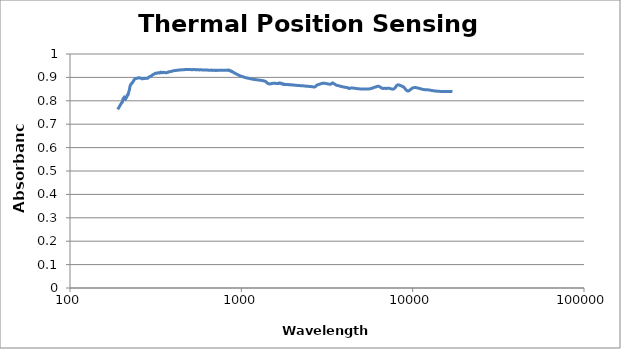
| Category | Absorbance |
|---|---|
| 190.0 | 0.763 |
| 200.0 | 0.791 |
| 202.0 | 0.794 |
| 204.0 | 0.809 |
| 206.0 | 0.812 |
| 208.0 | 0.817 |
| 210.0 | 0.806 |
| 212.0 | 0.812 |
| 214.0 | 0.814 |
| 216.0 | 0.825 |
| 218.0 | 0.825 |
| 220.0 | 0.837 |
| 222.0 | 0.846 |
| 224.0 | 0.862 |
| 226.0 | 0.868 |
| 228.0 | 0.874 |
| 230.0 | 0.875 |
| 232.0 | 0.88 |
| 234.0 | 0.883 |
| 236.0 | 0.888 |
| 238.0 | 0.892 |
| 240.0 | 0.895 |
| 242.0 | 0.896 |
| 244.0 | 0.896 |
| 246.0 | 0.896 |
| 248.0 | 0.897 |
| 250.0 | 0.898 |
| 252.0 | 0.899 |
| 254.0 | 0.898 |
| 256.0 | 0.897 |
| 258.0 | 0.897 |
| 260.0 | 0.897 |
| 262.0 | 0.895 |
| 264.0 | 0.893 |
| 266.0 | 0.894 |
| 268.0 | 0.896 |
| 270.0 | 0.896 |
| 272.0 | 0.896 |
| 274.0 | 0.895 |
| 276.0 | 0.896 |
| 278.0 | 0.896 |
| 280.0 | 0.897 |
| 282.0 | 0.896 |
| 284.0 | 0.896 |
| 286.0 | 0.898 |
| 288.0 | 0.901 |
| 290.0 | 0.902 |
| 292.0 | 0.904 |
| 294.0 | 0.903 |
| 296.0 | 0.905 |
| 298.0 | 0.906 |
| 300.0 | 0.908 |
| 302.0 | 0.91 |
| 304.0 | 0.911 |
| 306.0 | 0.912 |
| 308.0 | 0.913 |
| 310.0 | 0.914 |
| 312.0 | 0.916 |
| 314.0 | 0.918 |
| 316.0 | 0.918 |
| 318.0 | 0.917 |
| 320.0 | 0.917 |
| 322.0 | 0.918 |
| 324.0 | 0.919 |
| 326.0 | 0.92 |
| 328.0 | 0.92 |
| 330.0 | 0.919 |
| 332.0 | 0.919 |
| 334.0 | 0.919 |
| 336.0 | 0.92 |
| 338.0 | 0.922 |
| 340.0 | 0.922 |
| 342.0 | 0.922 |
| 344.0 | 0.92 |
| 346.0 | 0.92 |
| 348.0 | 0.92 |
| 350.0 | 0.921 |
| 352.0 | 0.922 |
| 354.0 | 0.921 |
| 356.0 | 0.921 |
| 358.0 | 0.921 |
| 360.0 | 0.92 |
| 362.0 | 0.92 |
| 364.0 | 0.92 |
| 366.0 | 0.92 |
| 368.0 | 0.92 |
| 370.0 | 0.921 |
| 372.0 | 0.921 |
| 374.0 | 0.923 |
| 376.0 | 0.924 |
| 378.0 | 0.924 |
| 380.0 | 0.924 |
| 382.0 | 0.924 |
| 384.0 | 0.925 |
| 386.0 | 0.925 |
| 388.0 | 0.925 |
| 390.0 | 0.926 |
| 392.0 | 0.926 |
| 394.0 | 0.926 |
| 396.0 | 0.927 |
| 398.0 | 0.927 |
| 400.0 | 0.928 |
| 402.0 | 0.928 |
| 404.0 | 0.928 |
| 406.0 | 0.929 |
| 408.0 | 0.929 |
| 410.0 | 0.929 |
| 412.0 | 0.929 |
| 414.0 | 0.93 |
| 416.0 | 0.93 |
| 418.0 | 0.93 |
| 420.0 | 0.93 |
| 422.0 | 0.93 |
| 424.0 | 0.931 |
| 426.0 | 0.931 |
| 428.0 | 0.931 |
| 430.0 | 0.931 |
| 432.0 | 0.931 |
| 434.0 | 0.931 |
| 436.0 | 0.932 |
| 438.0 | 0.932 |
| 440.0 | 0.932 |
| 442.0 | 0.932 |
| 444.0 | 0.932 |
| 446.0 | 0.932 |
| 448.0 | 0.932 |
| 450.0 | 0.933 |
| 452.0 | 0.933 |
| 454.0 | 0.932 |
| 456.0 | 0.932 |
| 458.0 | 0.933 |
| 460.0 | 0.933 |
| 462.0 | 0.933 |
| 464.0 | 0.933 |
| 466.0 | 0.933 |
| 468.0 | 0.933 |
| 470.0 | 0.934 |
| 472.0 | 0.933 |
| 474.0 | 0.933 |
| 476.0 | 0.933 |
| 478.0 | 0.933 |
| 480.0 | 0.934 |
| 482.0 | 0.934 |
| 484.0 | 0.934 |
| 486.0 | 0.933 |
| 488.0 | 0.934 |
| 490.0 | 0.933 |
| 492.0 | 0.933 |
| 494.0 | 0.934 |
| 496.0 | 0.934 |
| 498.0 | 0.934 |
| 500.0 | 0.934 |
| 502.0 | 0.934 |
| 504.0 | 0.934 |
| 506.0 | 0.933 |
| 508.0 | 0.933 |
| 510.0 | 0.933 |
| 512.0 | 0.933 |
| 514.0 | 0.933 |
| 516.0 | 0.933 |
| 518.0 | 0.933 |
| 520.0 | 0.933 |
| 522.0 | 0.933 |
| 524.0 | 0.933 |
| 526.0 | 0.934 |
| 528.0 | 0.933 |
| 530.0 | 0.933 |
| 532.0 | 0.933 |
| 534.0 | 0.933 |
| 536.0 | 0.933 |
| 538.0 | 0.933 |
| 540.0 | 0.933 |
| 542.0 | 0.933 |
| 544.0 | 0.933 |
| 546.0 | 0.933 |
| 548.0 | 0.933 |
| 550.0 | 0.933 |
| 552.0 | 0.933 |
| 554.0 | 0.933 |
| 556.0 | 0.933 |
| 558.0 | 0.933 |
| 560.0 | 0.933 |
| 562.0 | 0.933 |
| 564.0 | 0.933 |
| 566.0 | 0.933 |
| 568.0 | 0.932 |
| 570.0 | 0.932 |
| 572.0 | 0.932 |
| 574.0 | 0.932 |
| 576.0 | 0.932 |
| 578.0 | 0.933 |
| 580.0 | 0.932 |
| 582.0 | 0.932 |
| 584.0 | 0.932 |
| 586.0 | 0.932 |
| 588.0 | 0.932 |
| 590.0 | 0.932 |
| 592.0 | 0.932 |
| 594.0 | 0.932 |
| 596.0 | 0.932 |
| 598.0 | 0.932 |
| 600.0 | 0.932 |
| 602.0 | 0.932 |
| 604.0 | 0.932 |
| 606.0 | 0.932 |
| 608.0 | 0.932 |
| 610.0 | 0.932 |
| 612.0 | 0.932 |
| 614.0 | 0.932 |
| 616.0 | 0.931 |
| 618.0 | 0.931 |
| 620.0 | 0.931 |
| 622.0 | 0.932 |
| 624.0 | 0.932 |
| 626.0 | 0.932 |
| 628.0 | 0.932 |
| 630.0 | 0.932 |
| 632.0 | 0.932 |
| 634.0 | 0.931 |
| 636.0 | 0.931 |
| 638.0 | 0.931 |
| 640.0 | 0.931 |
| 642.0 | 0.931 |
| 644.0 | 0.931 |
| 646.0 | 0.931 |
| 648.0 | 0.931 |
| 650.0 | 0.931 |
| 652.0 | 0.931 |
| 654.0 | 0.93 |
| 656.0 | 0.93 |
| 658.0 | 0.93 |
| 660.0 | 0.931 |
| 662.0 | 0.931 |
| 664.0 | 0.931 |
| 666.0 | 0.931 |
| 668.0 | 0.931 |
| 670.0 | 0.931 |
| 672.0 | 0.931 |
| 674.0 | 0.931 |
| 676.0 | 0.93 |
| 678.0 | 0.93 |
| 680.0 | 0.93 |
| 682.0 | 0.93 |
| 684.0 | 0.93 |
| 686.0 | 0.931 |
| 688.0 | 0.931 |
| 690.0 | 0.931 |
| 692.0 | 0.93 |
| 694.0 | 0.93 |
| 696.0 | 0.93 |
| 698.0 | 0.93 |
| 700.0 | 0.93 |
| 702.0 | 0.93 |
| 704.0 | 0.93 |
| 706.0 | 0.929 |
| 708.0 | 0.93 |
| 710.0 | 0.93 |
| 712.0 | 0.931 |
| 714.0 | 0.93 |
| 716.0 | 0.93 |
| 718.0 | 0.93 |
| 720.0 | 0.93 |
| 722.0 | 0.93 |
| 724.0 | 0.93 |
| 726.0 | 0.93 |
| 728.0 | 0.93 |
| 730.0 | 0.93 |
| 732.0 | 0.93 |
| 734.0 | 0.93 |
| 736.0 | 0.93 |
| 738.0 | 0.93 |
| 740.0 | 0.93 |
| 742.0 | 0.93 |
| 744.0 | 0.93 |
| 746.0 | 0.93 |
| 748.0 | 0.93 |
| 750.0 | 0.93 |
| 752.0 | 0.93 |
| 754.0 | 0.93 |
| 756.0 | 0.93 |
| 758.0 | 0.93 |
| 760.0 | 0.93 |
| 762.0 | 0.93 |
| 764.0 | 0.93 |
| 766.0 | 0.93 |
| 768.0 | 0.93 |
| 770.0 | 0.93 |
| 772.0 | 0.93 |
| 774.0 | 0.93 |
| 776.0 | 0.93 |
| 778.0 | 0.93 |
| 780.0 | 0.93 |
| 782.0 | 0.93 |
| 784.0 | 0.93 |
| 786.0 | 0.93 |
| 788.0 | 0.93 |
| 790.0 | 0.93 |
| 792.0 | 0.931 |
| 794.0 | 0.931 |
| 796.0 | 0.931 |
| 798.0 | 0.931 |
| 800.0 | 0.931 |
| 802.0 | 0.931 |
| 804.0 | 0.93 |
| 806.0 | 0.931 |
| 808.0 | 0.931 |
| 810.0 | 0.931 |
| 812.0 | 0.931 |
| 814.0 | 0.931 |
| 816.0 | 0.93 |
| 818.0 | 0.93 |
| 820.0 | 0.93 |
| 822.0 | 0.93 |
| 824.0 | 0.93 |
| 826.0 | 0.93 |
| 828.0 | 0.93 |
| 830.0 | 0.931 |
| 832.0 | 0.931 |
| 834.0 | 0.931 |
| 836.0 | 0.931 |
| 838.0 | 0.932 |
| 840.0 | 0.932 |
| 842.0 | 0.931 |
| 844.0 | 0.931 |
| 846.0 | 0.931 |
| 848.0 | 0.929 |
| 850.0 | 0.929 |
| 852.0 | 0.93 |
| 854.0 | 0.929 |
| 856.0 | 0.928 |
| 858.0 | 0.929 |
| 860.0 | 0.928 |
| 862.0 | 0.928 |
| 864.0 | 0.928 |
| 866.0 | 0.928 |
| 868.0 | 0.928 |
| 870.0 | 0.927 |
| 872.0 | 0.926 |
| 874.0 | 0.925 |
| 876.0 | 0.925 |
| 878.0 | 0.924 |
| 880.0 | 0.924 |
| 882.0 | 0.925 |
| 884.0 | 0.925 |
| 886.0 | 0.925 |
| 888.0 | 0.924 |
| 890.0 | 0.924 |
| 892.0 | 0.924 |
| 894.0 | 0.923 |
| 896.0 | 0.922 |
| 898.0 | 0.922 |
| 900.0 | 0.921 |
| 902.0 | 0.921 |
| 904.0 | 0.921 |
| 906.0 | 0.92 |
| 908.0 | 0.92 |
| 910.0 | 0.919 |
| 912.0 | 0.919 |
| 914.0 | 0.918 |
| 916.0 | 0.918 |
| 918.0 | 0.918 |
| 920.0 | 0.917 |
| 922.0 | 0.917 |
| 924.0 | 0.917 |
| 926.0 | 0.916 |
| 928.0 | 0.916 |
| 930.0 | 0.916 |
| 932.0 | 0.915 |
| 934.0 | 0.915 |
| 936.0 | 0.915 |
| 938.0 | 0.914 |
| 940.0 | 0.914 |
| 942.0 | 0.913 |
| 944.0 | 0.913 |
| 946.0 | 0.912 |
| 948.0 | 0.912 |
| 950.0 | 0.912 |
| 952.0 | 0.912 |
| 954.0 | 0.911 |
| 956.0 | 0.911 |
| 958.0 | 0.911 |
| 960.0 | 0.91 |
| 962.0 | 0.91 |
| 964.0 | 0.91 |
| 966.0 | 0.909 |
| 968.0 | 0.909 |
| 970.0 | 0.909 |
| 972.0 | 0.909 |
| 974.0 | 0.908 |
| 976.0 | 0.908 |
| 978.0 | 0.908 |
| 980.0 | 0.907 |
| 982.0 | 0.907 |
| 984.0 | 0.907 |
| 986.0 | 0.906 |
| 988.0 | 0.906 |
| 990.0 | 0.906 |
| 992.0 | 0.906 |
| 994.0 | 0.906 |
| 996.0 | 0.905 |
| 998.0 | 0.905 |
| 1000.0 | 0.905 |
| 1002.0 | 0.905 |
| 1004.0 | 0.904 |
| 1006.0 | 0.904 |
| 1008.0 | 0.904 |
| 1010.0 | 0.904 |
| 1012.0 | 0.903 |
| 1014.0 | 0.903 |
| 1016.0 | 0.903 |
| 1018.0 | 0.903 |
| 1020.0 | 0.903 |
| 1022.0 | 0.903 |
| 1024.0 | 0.902 |
| 1026.0 | 0.902 |
| 1028.0 | 0.902 |
| 1030.0 | 0.902 |
| 1032.0 | 0.901 |
| 1034.0 | 0.901 |
| 1036.0 | 0.901 |
| 1038.0 | 0.901 |
| 1040.0 | 0.901 |
| 1042.0 | 0.9 |
| 1044.0 | 0.9 |
| 1046.0 | 0.9 |
| 1048.0 | 0.9 |
| 1050.0 | 0.9 |
| 1052.0 | 0.9 |
| 1054.0 | 0.899 |
| 1056.0 | 0.899 |
| 1058.0 | 0.899 |
| 1060.0 | 0.899 |
| 1062.0 | 0.899 |
| 1064.0 | 0.898 |
| 1066.0 | 0.898 |
| 1068.0 | 0.898 |
| 1070.0 | 0.898 |
| 1072.0 | 0.898 |
| 1074.0 | 0.898 |
| 1076.0 | 0.898 |
| 1078.0 | 0.898 |
| 1080.0 | 0.897 |
| 1082.0 | 0.897 |
| 1084.0 | 0.897 |
| 1086.0 | 0.897 |
| 1088.0 | 0.897 |
| 1090.0 | 0.897 |
| 1092.0 | 0.897 |
| 1094.0 | 0.896 |
| 1096.0 | 0.896 |
| 1098.0 | 0.896 |
| 1100.0 | 0.896 |
| 1102.0 | 0.896 |
| 1104.0 | 0.896 |
| 1106.0 | 0.896 |
| 1108.0 | 0.896 |
| 1110.0 | 0.896 |
| 1112.0 | 0.896 |
| 1114.0 | 0.895 |
| 1116.0 | 0.895 |
| 1118.0 | 0.895 |
| 1120.0 | 0.895 |
| 1122.0 | 0.895 |
| 1124.0 | 0.895 |
| 1126.0 | 0.895 |
| 1128.0 | 0.894 |
| 1130.0 | 0.894 |
| 1132.0 | 0.894 |
| 1134.0 | 0.894 |
| 1136.0 | 0.894 |
| 1138.0 | 0.894 |
| 1140.0 | 0.894 |
| 1142.0 | 0.894 |
| 1144.0 | 0.894 |
| 1146.0 | 0.893 |
| 1148.0 | 0.893 |
| 1150.0 | 0.893 |
| 1152.0 | 0.893 |
| 1154.0 | 0.893 |
| 1156.0 | 0.893 |
| 1158.0 | 0.893 |
| 1160.0 | 0.893 |
| 1162.0 | 0.893 |
| 1164.0 | 0.892 |
| 1166.0 | 0.892 |
| 1168.0 | 0.892 |
| 1170.0 | 0.892 |
| 1172.0 | 0.892 |
| 1174.0 | 0.892 |
| 1176.0 | 0.892 |
| 1178.0 | 0.892 |
| 1180.0 | 0.892 |
| 1182.0 | 0.892 |
| 1184.0 | 0.892 |
| 1186.0 | 0.891 |
| 1188.0 | 0.891 |
| 1190.0 | 0.891 |
| 1192.0 | 0.891 |
| 1194.0 | 0.891 |
| 1196.0 | 0.891 |
| 1198.0 | 0.891 |
| 1200.0 | 0.891 |
| 1202.0 | 0.891 |
| 1204.0 | 0.891 |
| 1206.0 | 0.891 |
| 1208.0 | 0.891 |
| 1210.0 | 0.89 |
| 1212.0 | 0.89 |
| 1214.0 | 0.89 |
| 1216.0 | 0.89 |
| 1218.0 | 0.89 |
| 1220.0 | 0.89 |
| 1222.0 | 0.89 |
| 1224.0 | 0.89 |
| 1226.0 | 0.89 |
| 1228.0 | 0.89 |
| 1230.0 | 0.89 |
| 1232.0 | 0.89 |
| 1234.0 | 0.89 |
| 1236.0 | 0.89 |
| 1238.0 | 0.89 |
| 1240.0 | 0.889 |
| 1242.0 | 0.889 |
| 1244.0 | 0.889 |
| 1246.0 | 0.889 |
| 1248.0 | 0.889 |
| 1250.0 | 0.889 |
| 1252.0 | 0.889 |
| 1254.0 | 0.889 |
| 1256.0 | 0.889 |
| 1258.0 | 0.889 |
| 1260.0 | 0.889 |
| 1262.0 | 0.889 |
| 1264.0 | 0.889 |
| 1266.0 | 0.889 |
| 1268.0 | 0.889 |
| 1270.0 | 0.888 |
| 1272.0 | 0.888 |
| 1274.0 | 0.888 |
| 1276.0 | 0.888 |
| 1278.0 | 0.888 |
| 1280.0 | 0.888 |
| 1282.0 | 0.888 |
| 1284.0 | 0.888 |
| 1286.0 | 0.888 |
| 1288.0 | 0.888 |
| 1290.0 | 0.888 |
| 1292.0 | 0.888 |
| 1294.0 | 0.888 |
| 1296.0 | 0.888 |
| 1298.0 | 0.887 |
| 1300.0 | 0.887 |
| 1302.0 | 0.887 |
| 1304.0 | 0.887 |
| 1306.0 | 0.887 |
| 1308.0 | 0.887 |
| 1310.0 | 0.887 |
| 1312.0 | 0.887 |
| 1314.0 | 0.887 |
| 1316.0 | 0.887 |
| 1318.0 | 0.887 |
| 1320.0 | 0.887 |
| 1322.0 | 0.887 |
| 1324.0 | 0.886 |
| 1326.0 | 0.886 |
| 1328.0 | 0.886 |
| 1330.0 | 0.886 |
| 1332.0 | 0.886 |
| 1334.0 | 0.886 |
| 1336.0 | 0.886 |
| 1338.0 | 0.886 |
| 1340.0 | 0.886 |
| 1342.0 | 0.886 |
| 1344.0 | 0.885 |
| 1346.0 | 0.885 |
| 1348.0 | 0.885 |
| 1350.0 | 0.885 |
| 1352.0 | 0.885 |
| 1354.0 | 0.885 |
| 1356.0 | 0.885 |
| 1358.0 | 0.885 |
| 1360.0 | 0.885 |
| 1362.0 | 0.885 |
| 1364.0 | 0.885 |
| 1366.0 | 0.884 |
| 1368.0 | 0.884 |
| 1370.0 | 0.884 |
| 1372.0 | 0.884 |
| 1374.0 | 0.884 |
| 1376.0 | 0.884 |
| 1378.0 | 0.883 |
| 1380.0 | 0.883 |
| 1382.0 | 0.883 |
| 1384.0 | 0.883 |
| 1386.0 | 0.882 |
| 1388.0 | 0.882 |
| 1390.0 | 0.882 |
| 1392.0 | 0.881 |
| 1394.0 | 0.881 |
| 1396.0 | 0.881 |
| 1398.0 | 0.88 |
| 1400.0 | 0.88 |
| 1402.0 | 0.879 |
| 1404.0 | 0.879 |
| 1406.0 | 0.878 |
| 1408.0 | 0.878 |
| 1410.0 | 0.878 |
| 1412.0 | 0.877 |
| 1414.0 | 0.877 |
| 1416.0 | 0.876 |
| 1418.0 | 0.876 |
| 1420.0 | 0.876 |
| 1422.0 | 0.875 |
| 1424.0 | 0.875 |
| 1426.0 | 0.875 |
| 1428.0 | 0.874 |
| 1430.0 | 0.874 |
| 1432.0 | 0.874 |
| 1434.0 | 0.874 |
| 1436.0 | 0.873 |
| 1438.0 | 0.873 |
| 1440.0 | 0.873 |
| 1442.0 | 0.873 |
| 1444.0 | 0.873 |
| 1446.0 | 0.873 |
| 1448.0 | 0.873 |
| 1450.0 | 0.873 |
| 1452.0 | 0.873 |
| 1454.0 | 0.872 |
| 1456.0 | 0.872 |
| 1458.0 | 0.872 |
| 1460.0 | 0.872 |
| 1462.0 | 0.872 |
| 1464.0 | 0.872 |
| 1466.0 | 0.872 |
| 1468.0 | 0.872 |
| 1470.0 | 0.872 |
| 1472.0 | 0.872 |
| 1474.0 | 0.872 |
| 1476.0 | 0.872 |
| 1478.0 | 0.872 |
| 1480.0 | 0.872 |
| 1482.0 | 0.873 |
| 1484.0 | 0.873 |
| 1486.0 | 0.873 |
| 1488.0 | 0.873 |
| 1490.0 | 0.873 |
| 1492.0 | 0.873 |
| 1494.0 | 0.873 |
| 1496.0 | 0.873 |
| 1498.0 | 0.873 |
| 1500.0 | 0.873 |
| 1502.0 | 0.873 |
| 1504.0 | 0.874 |
| 1506.0 | 0.874 |
| 1508.0 | 0.874 |
| 1510.0 | 0.874 |
| 1512.0 | 0.874 |
| 1514.0 | 0.874 |
| 1516.0 | 0.874 |
| 1518.0 | 0.874 |
| 1520.0 | 0.874 |
| 1522.0 | 0.874 |
| 1524.0 | 0.874 |
| 1526.0 | 0.874 |
| 1528.0 | 0.875 |
| 1530.0 | 0.875 |
| 1532.0 | 0.875 |
| 1534.0 | 0.875 |
| 1536.0 | 0.875 |
| 1538.0 | 0.875 |
| 1540.0 | 0.875 |
| 1542.0 | 0.875 |
| 1544.0 | 0.875 |
| 1546.0 | 0.875 |
| 1548.0 | 0.875 |
| 1550.0 | 0.875 |
| 1552.0 | 0.875 |
| 1554.0 | 0.875 |
| 1556.0 | 0.875 |
| 1558.0 | 0.875 |
| 1560.0 | 0.875 |
| 1562.0 | 0.875 |
| 1564.0 | 0.875 |
| 1566.0 | 0.875 |
| 1568.0 | 0.875 |
| 1570.0 | 0.874 |
| 1572.0 | 0.875 |
| 1574.0 | 0.875 |
| 1576.0 | 0.874 |
| 1578.0 | 0.874 |
| 1580.0 | 0.874 |
| 1582.0 | 0.874 |
| 1584.0 | 0.874 |
| 1586.0 | 0.875 |
| 1588.0 | 0.874 |
| 1590.0 | 0.875 |
| 1592.0 | 0.874 |
| 1594.0 | 0.874 |
| 1596.0 | 0.874 |
| 1598.0 | 0.874 |
| 1600.0 | 0.874 |
| 1602.0 | 0.874 |
| 1604.0 | 0.874 |
| 1606.0 | 0.874 |
| 1608.0 | 0.874 |
| 1610.0 | 0.874 |
| 1612.0 | 0.874 |
| 1614.0 | 0.874 |
| 1616.0 | 0.874 |
| 1618.0 | 0.874 |
| 1620.0 | 0.874 |
| 1622.0 | 0.874 |
| 1624.0 | 0.874 |
| 1626.0 | 0.874 |
| 1628.0 | 0.874 |
| 1630.0 | 0.874 |
| 1632.0 | 0.874 |
| 1634.0 | 0.874 |
| 1636.0 | 0.874 |
| 1638.0 | 0.874 |
| 1640.0 | 0.874 |
| 1642.0 | 0.874 |
| 1644.0 | 0.874 |
| 1646.0 | 0.874 |
| 1648.0 | 0.874 |
| 1650.0 | 0.875 |
| 1652.0 | 0.875 |
| 1654.0 | 0.875 |
| 1656.0 | 0.876 |
| 1658.0 | 0.876 |
| 1660.0 | 0.875 |
| 1662.0 | 0.875 |
| 1664.0 | 0.875 |
| 1666.0 | 0.875 |
| 1668.0 | 0.875 |
| 1670.0 | 0.875 |
| 1672.0 | 0.876 |
| 1674.0 | 0.875 |
| 1676.0 | 0.876 |
| 1678.0 | 0.876 |
| 1680.0 | 0.876 |
| 1682.0 | 0.876 |
| 1684.0 | 0.876 |
| 1686.0 | 0.876 |
| 1688.0 | 0.875 |
| 1690.0 | 0.875 |
| 1692.0 | 0.875 |
| 1694.0 | 0.875 |
| 1696.0 | 0.875 |
| 1698.0 | 0.875 |
| 1700.0 | 0.875 |
| 1702.0 | 0.875 |
| 1704.0 | 0.874 |
| 1706.0 | 0.874 |
| 1708.0 | 0.873 |
| 1710.0 | 0.873 |
| 1712.0 | 0.872 |
| 1714.0 | 0.872 |
| 1716.0 | 0.873 |
| 1718.0 | 0.873 |
| 1720.0 | 0.872 |
| 1722.0 | 0.873 |
| 1724.0 | 0.873 |
| 1726.0 | 0.873 |
| 1728.0 | 0.873 |
| 1730.0 | 0.874 |
| 1732.0 | 0.874 |
| 1734.0 | 0.873 |
| 1736.0 | 0.873 |
| 1738.0 | 0.873 |
| 1740.0 | 0.873 |
| 1742.0 | 0.872 |
| 1744.0 | 0.872 |
| 1746.0 | 0.872 |
| 1748.0 | 0.871 |
| 1750.0 | 0.871 |
| 1752.0 | 0.871 |
| 1754.0 | 0.87 |
| 1756.0 | 0.871 |
| 1758.0 | 0.872 |
| 1760.0 | 0.871 |
| 1762.0 | 0.871 |
| 1764.0 | 0.871 |
| 1766.0 | 0.871 |
| 1768.0 | 0.87 |
| 1770.0 | 0.87 |
| 1772.0 | 0.871 |
| 1774.0 | 0.871 |
| 1776.0 | 0.87 |
| 1778.0 | 0.871 |
| 1780.0 | 0.871 |
| 1782.0 | 0.871 |
| 1784.0 | 0.87 |
| 1786.0 | 0.87 |
| 1788.0 | 0.87 |
| 1790.0 | 0.87 |
| 1792.0 | 0.87 |
| 1794.0 | 0.87 |
| 1796.0 | 0.871 |
| 1800.0 | 0.87 |
| 1805.0 | 0.87 |
| 1810.0 | 0.87 |
| 1815.0 | 0.87 |
| 1820.0 | 0.87 |
| 1826.0 | 0.87 |
| 1831.0 | 0.87 |
| 1836.0 | 0.869 |
| 1841.0 | 0.869 |
| 1846.0 | 0.869 |
| 1852.0 | 0.869 |
| 1857.0 | 0.869 |
| 1862.0 | 0.869 |
| 1868.0 | 0.869 |
| 1873.0 | 0.87 |
| 1879.0 | 0.87 |
| 1884.0 | 0.869 |
| 1889.0 | 0.869 |
| 1895.0 | 0.869 |
| 1901.0 | 0.869 |
| 1906.0 | 0.869 |
| 1912.0 | 0.869 |
| 1917.0 | 0.869 |
| 1923.0 | 0.869 |
| 1929.0 | 0.868 |
| 1935.0 | 0.868 |
| 1940.0 | 0.868 |
| 1946.0 | 0.868 |
| 1952.0 | 0.868 |
| 1958.0 | 0.868 |
| 1964.0 | 0.868 |
| 1970.0 | 0.868 |
| 1976.0 | 0.868 |
| 1982.0 | 0.868 |
| 1988.0 | 0.868 |
| 1994.0 | 0.868 |
| 2000.0 | 0.867 |
| 2006.0 | 0.867 |
| 2013.0 | 0.867 |
| 2019.0 | 0.868 |
| 2025.0 | 0.868 |
| 2032.0 | 0.867 |
| 2038.0 | 0.867 |
| 2044.0 | 0.867 |
| 2051.0 | 0.867 |
| 2057.0 | 0.867 |
| 2064.0 | 0.867 |
| 2071.0 | 0.866 |
| 2077.0 | 0.866 |
| 2084.0 | 0.866 |
| 2091.0 | 0.866 |
| 2097.0 | 0.866 |
| 2104.0 | 0.866 |
| 2111.0 | 0.866 |
| 2118.0 | 0.866 |
| 2125.0 | 0.866 |
| 2132.0 | 0.866 |
| 2139.0 | 0.865 |
| 2146.0 | 0.865 |
| 2153.0 | 0.865 |
| 2160.0 | 0.866 |
| 2168.0 | 0.866 |
| 2175.0 | 0.865 |
| 2182.0 | 0.865 |
| 2189.0 | 0.865 |
| 2197.0 | 0.865 |
| 2204.0 | 0.865 |
| 2212.0 | 0.865 |
| 2219.0 | 0.864 |
| 2227.0 | 0.864 |
| 2235.0 | 0.864 |
| 2243.0 | 0.864 |
| 2250.0 | 0.864 |
| 2258.0 | 0.864 |
| 2266.0 | 0.864 |
| 2274.0 | 0.864 |
| 2282.0 | 0.864 |
| 2290.0 | 0.864 |
| 2298.0 | 0.864 |
| 2306.0 | 0.864 |
| 2315.0 | 0.864 |
| 2323.0 | 0.863 |
| 2331.0 | 0.863 |
| 2340.0 | 0.863 |
| 2348.0 | 0.863 |
| 2357.0 | 0.863 |
| 2365.0 | 0.863 |
| 2374.0 | 0.863 |
| 2383.0 | 0.863 |
| 2391.0 | 0.863 |
| 2400.0 | 0.862 |
| 2409.0 | 0.862 |
| 2418.0 | 0.862 |
| 2427.0 | 0.862 |
| 2436.0 | 0.862 |
| 2446.0 | 0.862 |
| 2455.0 | 0.862 |
| 2464.0 | 0.862 |
| 2474.0 | 0.862 |
| 2483.0 | 0.862 |
| 2493.0 | 0.862 |
| 2502.0 | 0.861 |
| 2512.0 | 0.861 |
| 2522.0 | 0.861 |
| 2532.0 | 0.861 |
| 2542.0 | 0.861 |
| 2552.0 | 0.861 |
| 2562.0 | 0.861 |
| 2572.0 | 0.86 |
| 2582.0 | 0.86 |
| 2592.0 | 0.86 |
| 2603.0 | 0.86 |
| 2613.0 | 0.86 |
| 2624.0 | 0.86 |
| 2635.0 | 0.859 |
| 2645.0 | 0.859 |
| 2656.0 | 0.859 |
| 2667.0 | 0.859 |
| 2678.0 | 0.859 |
| 2689.0 | 0.86 |
| 2700.0 | 0.86 |
| 2712.0 | 0.861 |
| 2723.0 | 0.862 |
| 2735.0 | 0.864 |
| 2746.0 | 0.866 |
| 2758.0 | 0.867 |
| 2770.0 | 0.868 |
| 2781.0 | 0.868 |
| 2793.0 | 0.868 |
| 2806.0 | 0.869 |
| 2818.0 | 0.869 |
| 2830.0 | 0.87 |
| 2842.0 | 0.87 |
| 2855.0 | 0.87 |
| 2868.0 | 0.871 |
| 2880.0 | 0.872 |
| 2893.0 | 0.872 |
| 2906.0 | 0.873 |
| 2919.0 | 0.873 |
| 2933.0 | 0.873 |
| 2946.0 | 0.874 |
| 2959.0 | 0.874 |
| 2973.0 | 0.875 |
| 2987.0 | 0.875 |
| 3000.0 | 0.875 |
| 3014.0 | 0.875 |
| 3028.0 | 0.875 |
| 3043.0 | 0.875 |
| 3057.0 | 0.875 |
| 3072.0 | 0.875 |
| 3086.0 | 0.875 |
| 3101.0 | 0.874 |
| 3116.0 | 0.874 |
| 3131.0 | 0.874 |
| 3146.0 | 0.873 |
| 3161.0 | 0.873 |
| 3177.0 | 0.873 |
| 3193.0 | 0.872 |
| 3208.0 | 0.872 |
| 3224.0 | 0.872 |
| 3240.0 | 0.871 |
| 3257.0 | 0.871 |
| 3273.0 | 0.871 |
| 3290.0 | 0.871 |
| 3307.0 | 0.871 |
| 3324.0 | 0.871 |
| 3341.0 | 0.872 |
| 3358.0 | 0.873 |
| 3375.0 | 0.874 |
| 3393.0 | 0.876 |
| 3411.0 | 0.877 |
| 3429.0 | 0.876 |
| 3447.0 | 0.875 |
| 3466.0 | 0.873 |
| 3484.0 | 0.873 |
| 3503.0 | 0.872 |
| 3522.0 | 0.87 |
| 3541.0 | 0.869 |
| 3561.0 | 0.868 |
| 3581.0 | 0.867 |
| 3600.0 | 0.866 |
| 3621.0 | 0.866 |
| 3641.0 | 0.865 |
| 3662.0 | 0.865 |
| 3682.0 | 0.865 |
| 3703.0 | 0.864 |
| 3725.0 | 0.864 |
| 3746.0 | 0.863 |
| 3768.0 | 0.863 |
| 3790.0 | 0.862 |
| 3812.0 | 0.862 |
| 3835.0 | 0.861 |
| 3858.0 | 0.861 |
| 3881.0 | 0.86 |
| 3904.0 | 0.86 |
| 3928.0 | 0.859 |
| 3952.0 | 0.859 |
| 3976.0 | 0.859 |
| 4001.0 | 0.858 |
| 4025.0 | 0.858 |
| 4051.0 | 0.858 |
| 4076.0 | 0.857 |
| 4102.0 | 0.857 |
| 4128.0 | 0.857 |
| 4154.0 | 0.857 |
| 4181.0 | 0.856 |
| 4208.0 | 0.854 |
| 4236.0 | 0.853 |
| 4264.0 | 0.852 |
| 4292.0 | 0.853 |
| 4321.0 | 0.854 |
| 4350.0 | 0.855 |
| 4379.0 | 0.855 |
| 4409.0 | 0.855 |
| 4439.0 | 0.855 |
| 4470.0 | 0.855 |
| 4501.0 | 0.854 |
| 4532.0 | 0.854 |
| 4564.0 | 0.854 |
| 4596.0 | 0.853 |
| 4629.0 | 0.853 |
| 4663.0 | 0.853 |
| 4696.0 | 0.852 |
| 4731.0 | 0.852 |
| 4765.0 | 0.852 |
| 4801.0 | 0.852 |
| 4836.0 | 0.851 |
| 4873.0 | 0.851 |
| 4910.0 | 0.851 |
| 4947.0 | 0.851 |
| 4985.0 | 0.851 |
| 5024.0 | 0.851 |
| 5063.0 | 0.851 |
| 5103.0 | 0.851 |
| 5144.0 | 0.85 |
| 5185.0 | 0.85 |
| 5227.0 | 0.85 |
| 5269.0 | 0.85 |
| 5312.0 | 0.851 |
| 5356.0 | 0.851 |
| 5401.0 | 0.851 |
| 5446.0 | 0.851 |
| 5492.0 | 0.851 |
| 5539.0 | 0.851 |
| 5587.0 | 0.851 |
| 5636.0 | 0.851 |
| 5685.0 | 0.852 |
| 5735.0 | 0.853 |
| 5787.0 | 0.854 |
| 5839.0 | 0.855 |
| 5892.0 | 0.856 |
| 5946.0 | 0.857 |
| 6001.0 | 0.858 |
| 6057.0 | 0.859 |
| 6114.0 | 0.86 |
| 6172.0 | 0.861 |
| 6232.0 | 0.862 |
| 6292.0 | 0.862 |
| 6354.0 | 0.862 |
| 6417.0 | 0.86 |
| 6481.0 | 0.858 |
| 6546.0 | 0.856 |
| 6613.0 | 0.854 |
| 6681.0 | 0.853 |
| 6751.0 | 0.853 |
| 6822.0 | 0.853 |
| 6895.0 | 0.853 |
| 6969.0 | 0.853 |
| 7044.0 | 0.853 |
| 7122.0 | 0.854 |
| 7201.0 | 0.854 |
| 7282.0 | 0.854 |
| 7365.0 | 0.853 |
| 7449.0 | 0.851 |
| 7536.0 | 0.85 |
| 7625.0 | 0.85 |
| 7715.0 | 0.85 |
| 7808.0 | 0.852 |
| 7904.0 | 0.856 |
| 8001.0 | 0.861 |
| 8101.0 | 0.866 |
| 8204.0 | 0.868 |
| 8309.0 | 0.868 |
| 8417.0 | 0.866 |
| 8527.0 | 0.864 |
| 8641.0 | 0.863 |
| 8758.0 | 0.861 |
| 8878.0 | 0.858 |
| 9001.0 | 0.853 |
| 9128.0 | 0.848 |
| 9258.0 | 0.843 |
| 9393.0 | 0.842 |
| 9531.0 | 0.844 |
| 9673.0 | 0.847 |
| 9820.0 | 0.851 |
| 9971.0 | 0.854 |
| 10126.0 | 0.856 |
| 10287.0 | 0.857 |
| 10453.0 | 0.856 |
| 10624.0 | 0.855 |
| 10801.0 | 0.854 |
| 10985.0 | 0.852 |
| 11174.0 | 0.851 |
| 11370.0 | 0.85 |
| 11573.0 | 0.848 |
| 11783.0 | 0.847 |
| 12002.0 | 0.847 |
| 12228.0 | 0.847 |
| 12463.0 | 0.846 |
| 12708.0 | 0.845 |
| 12962.0 | 0.844 |
| 13226.0 | 0.843 |
| 13502.0 | 0.842 |
| 13789.0 | 0.841 |
| 14089.0 | 0.841 |
| 14402.0 | 0.84 |
| 14729.0 | 0.84 |
| 15072.0 | 0.839 |
| 15431.0 | 0.839 |
| 15807.0 | 0.84 |
| 16202.0 | 0.84 |
| 16618.0 | 0.839 |
| 17055.0 | 0.839 |